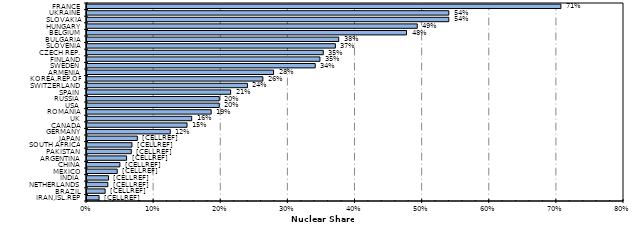
| Category | Percent |
|---|---|
| FRANCE | 0.706 |
| UKRAINE | 0.539 |
| SLOVAKIA | 0.539 |
| HUNGARY | 0.492 |
| BELGIUM | 0.476 |
| BULGARIA | 0.375 |
| SLOVENIA | 0.37 |
| CZECH REP. | 0.352 |
| FINLAND | 0.347 |
| SWEDEN | 0.34 |
| ARMENIA | 0.278 |
| KOREA,REP.OF | 0.262 |
| SWITZERLAND | 0.239 |
| SPAIN | 0.214 |
| RUSSIA | 0.197 |
| USA | 0.197 |
| ROMANIA | 0.185 |
| UK | 0.156 |
| CANADA | 0.149 |
| GERMANY | 0.124 |
| JAPAN | 0.075 |
| SOUTH AFRICA | 0.067 |
| PAKISTAN | 0.066 |
| ARGENTINA | 0.059 |
| CHINA | 0.049 |
| MEXICO | 0.045 |
| INDIA | 0.032 |
| NETHERLANDS | 0.031 |
| BRAZIL | 0.027 |
| IRAN,ISL.REP | 0.018 |